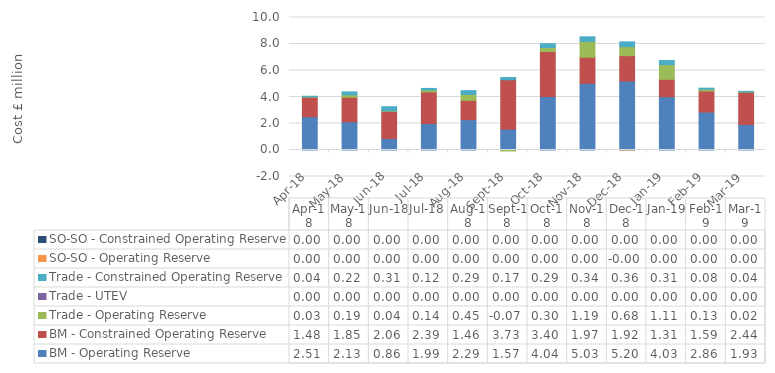
| Category | BM - Operating Reserve | BM - Constrained Operating Reserve | Trade - Operating Reserve | Trade - UTEV | Trade - Constrained Operating Reserve | SO-SO - Operating Reserve | SO-SO - Constrained Operating Reserve |
|---|---|---|---|---|---|---|---|
| 2018-04-30 | 2.511 | 1.476 | 0.028 | 0 | 0.042 | 0 | 0 |
| 2018-05-31 | 2.133 | 1.848 | 0.185 | 0 | 0.218 | 0 | 0 |
| 2018-06-30 | 0.863 | 2.058 | 0.037 | 0 | 0.309 | 0 | 0 |
| 2018-07-31 | 1.994 | 2.394 | 0.144 | 0 | 0.116 | 0 | 0 |
| 2018-08-31 | 2.288 | 1.458 | 0.45 | 0 | 0.285 | 0 | 0 |
| 2018-09-30 | 1.572 | 3.731 | -0.074 | 0 | 0.169 | 0 | 0 |
| 2018-10-31 | 4.041 | 3.398 | 0.297 | 0 | 0.286 | 0 | 0 |
| 2018-11-30 | 5.033 | 1.968 | 1.195 | 0 | 0.345 | 0 | 0 |
| 2018-12-31 | 5.204 | 1.915 | 0.678 | 0 | 0.362 | -0.001 | 0 |
| 2019-01-31 | 4.026 | 1.309 | 1.11 | 0 | 0.308 | 0 | 0 |
| 2019-02-28 | 2.864 | 1.59 | 0.129 | 0 | 0.082 | 0 | 0 |
| 2019-03-31 | 1.929 | 2.435 | 0.023 | 0 | 0.04 | 0 | 0 |